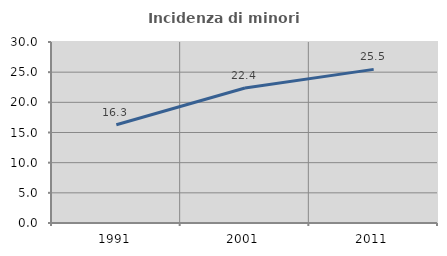
| Category | Incidenza di minori stranieri |
|---|---|
| 1991.0 | 16.279 |
| 2001.0 | 22.368 |
| 2011.0 | 25.463 |